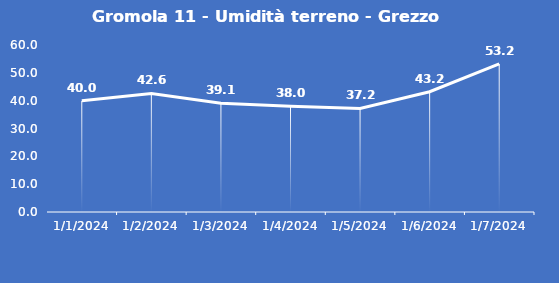
| Category | Gromola 11 - Umidità terreno - Grezzo (%VWC) |
|---|---|
| 1/1/24 | 40 |
| 1/2/24 | 42.6 |
| 1/3/24 | 39.1 |
| 1/4/24 | 38 |
| 1/5/24 | 37.2 |
| 1/6/24 | 43.2 |
| 1/7/24 | 53.2 |